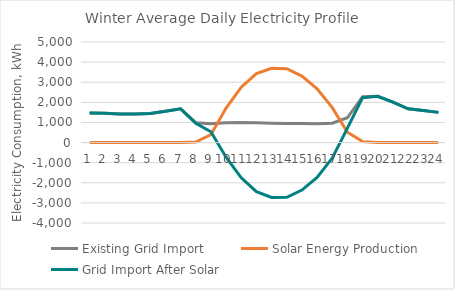
| Category | Existing Grid Import | Solar Energy Production  | Grid Import After Solar |
|---|---|---|---|
| 0 | 1475.136 | 0 | 1475.136 |
| 1 | 1461.534 | 0 | 1461.534 |
| 2 | 1418.764 | 0 | 1418.764 |
| 3 | 1418.384 | 0 | 1418.384 |
| 4 | 1442.78 | 0 | 1442.78 |
| 5 | 1559.45 | 0 | 1559.45 |
| 6 | 1675.576 | 0 | 1675.576 |
| 7 | 988.502 | 26.292 | 962.21 |
| 8 | 929.495 | 394.387 | 535.108 |
| 9 | 989.511 | 1715.584 | -726.073 |
| 10 | 1001.385 | 2754.137 | -1752.752 |
| 11 | 980.428 | 3424.596 | -2444.167 |
| 12 | 963.751 | 3694.093 | -2730.343 |
| 13 | 951.424 | 3674.374 | -2722.95 |
| 14 | 945.582 | 3306.279 | -2360.697 |
| 15 | 932.017 | 2668.687 | -1736.67 |
| 16 | 964.492 | 1735.304 | -770.812 |
| 17 | 1232.404 | 512.703 | 719.7 |
| 18 | 2278.159 | 46.012 | 2232.148 |
| 19 | 2300.174 | 0 | 2300.174 |
| 20 | 2005.853 | 0 | 2005.853 |
| 21 | 1680.565 | 0 | 1680.565 |
| 22 | 1588.261 | 0 | 1588.261 |
| 23 | 1500.565 | 0 | 1500.565 |